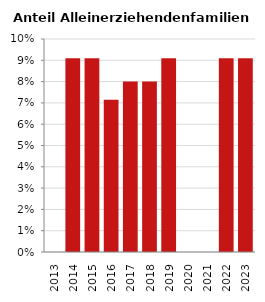
| Category | Anteil Alleinerziehende an Familien |
|---|---|
| 2013.0 | 0 |
| 2014.0 | 0.091 |
| 2015.0 | 0.091 |
| 2016.0 | 0.071 |
| 2017.0 | 0.08 |
| 2018.0 | 0.08 |
| 2019.0 | 0.091 |
| 2020.0 | 0 |
| 2021.0 | 0 |
| 2022.0 | 0.091 |
| 2023.0 | 0.091 |